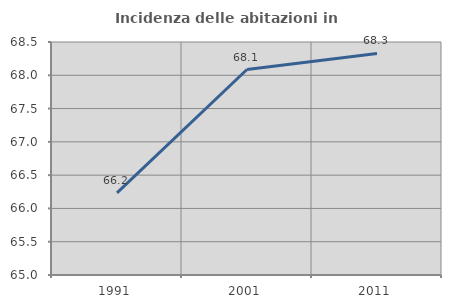
| Category | Incidenza delle abitazioni in proprietà  |
|---|---|
| 1991.0 | 66.235 |
| 2001.0 | 68.087 |
| 2011.0 | 68.328 |